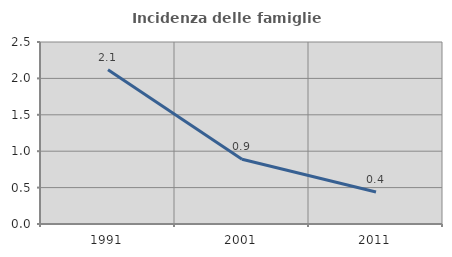
| Category | Incidenza delle famiglie numerose |
|---|---|
| 1991.0 | 2.118 |
| 2001.0 | 0.89 |
| 2011.0 | 0.44 |